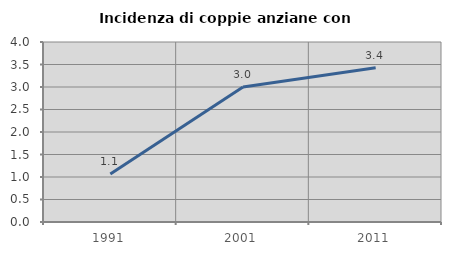
| Category | Incidenza di coppie anziane con figli |
|---|---|
| 1991.0 | 1.065 |
| 2001.0 | 2.998 |
| 2011.0 | 3.428 |